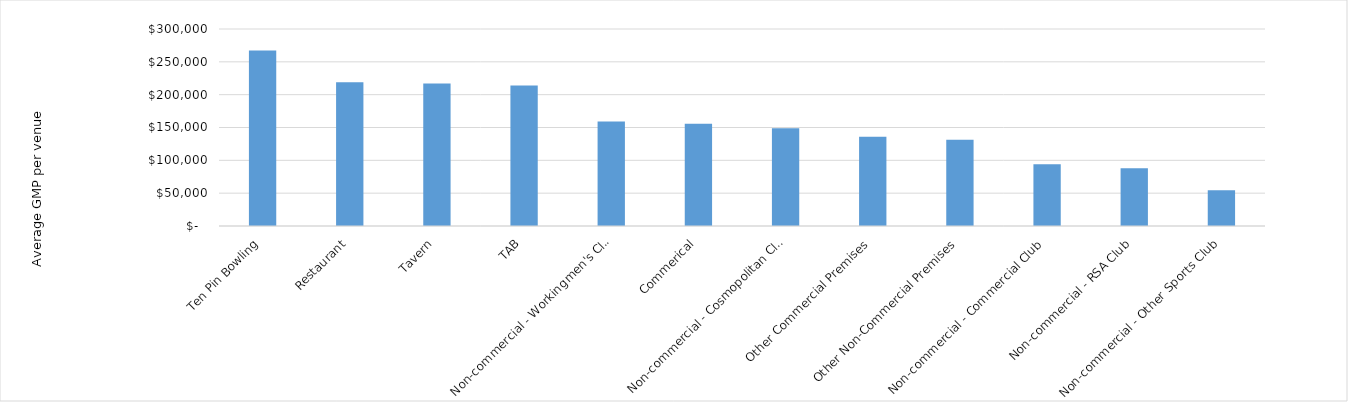
| Category | Series 0 |
|---|---|
| Ten Pin Bowling | 267265.037 |
| Restaurant | 219021.702 |
| Tavern | 217124.826 |
| TAB | 213873.954 |
| Non-commercial - Workingmen's Club | 159306.03 |
| Commerical | 155792.383 |
| Non-commercial - Cosmopolitan Club | 148910.443 |
| Other Commercial Premises | 136064.531 |
| Other Non-Commercial Premises | 131265.586 |
| Non-commercial - Commercial Club | 94020.586 |
| Non-commercial - RSA Club | 88017.452 |
| Non-commercial - Other Sports Club | 54567.375 |